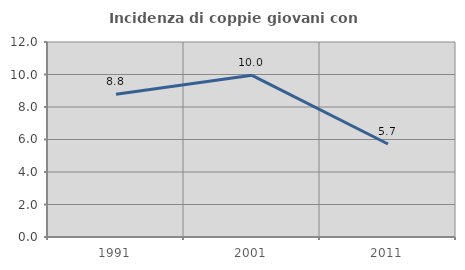
| Category | Incidenza di coppie giovani con figli |
|---|---|
| 1991.0 | 8.786 |
| 2001.0 | 9.951 |
| 2011.0 | 5.721 |